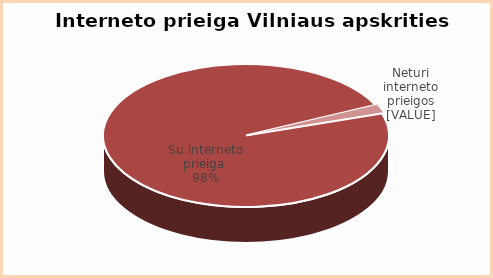
| Category | Series 0 |
|---|---|
| Su internetu | 0.98 |
| Be interneto | 0.02 |